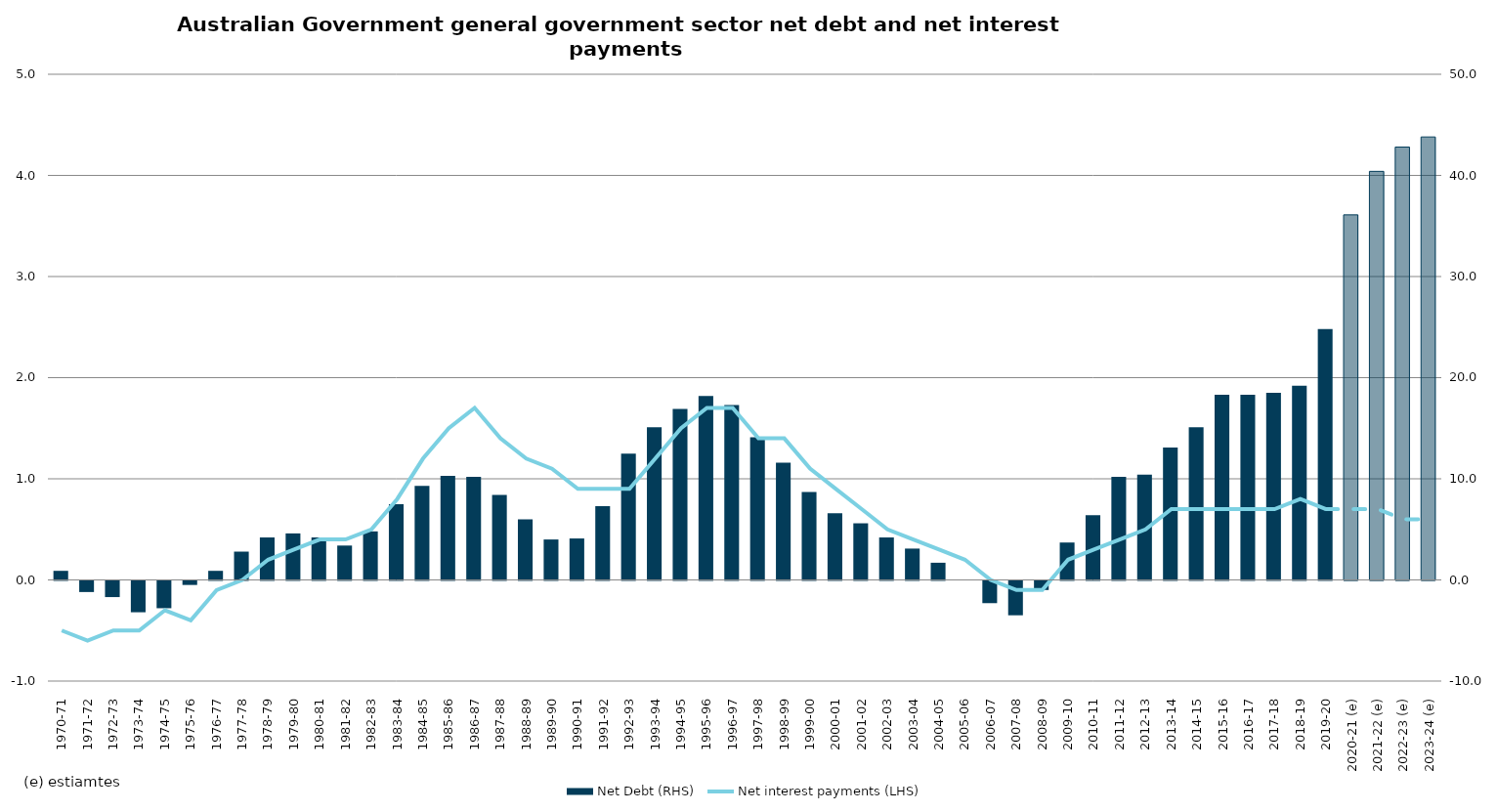
| Category | Net Debt (RHS) |
|---|---|
| 1970-71 | 0.9 |
| 1971-72 | -1.1 |
| 1972-73 | -1.6 |
| 1973-74 | -3.1 |
| 1974-75 | -2.7 |
| 1975-76 | -0.4 |
| 1976-77 | 0.9 |
| 1977-78 | 2.8 |
| 1978-79 | 4.2 |
| 1979-80 | 4.6 |
| 1980-81 | 4.2 |
| 1981-82 | 3.4 |
| 1982-83 | 4.8 |
| 1983-84 | 7.5 |
| 1984-85 | 9.3 |
| 1985-86 | 10.3 |
| 1986-87 | 10.2 |
| 1987-88 | 8.4 |
| 1988-89 | 6 |
| 1989-90 | 4 |
| 1990-91 | 4.1 |
| 1991-92 | 7.3 |
| 1992-93 | 12.5 |
| 1993-94 | 15.1 |
| 1994-95 | 16.9 |
| 1995-96 | 18.2 |
| 1996-97 | 17.3 |
| 1997-98 | 14.1 |
| 1998-99 | 11.6 |
| 1999-00 | 8.7 |
| 2000-01 | 6.6 |
| 2001-02 | 5.6 |
| 2002-03 | 4.2 |
| 2003-04 | 3.1 |
| 2004-05 | 1.7 |
| 2005-06 | 0 |
| 2006-07 | -2.2 |
| 2007-08 | -3.4 |
| 2008-09 | -0.9 |
| 2009-10 | 3.7 |
| 2010-11 | 6.4 |
| 2011-12 | 10.2 |
| 2012-13 | 10.4 |
| 2013-14 | 13.1 |
| 2014-15 | 15.1 |
| 2015-16 | 18.3 |
| 2016-17 | 18.3 |
| 2017-18 | 18.5 |
| 2018-19 | 19.2 |
| 2019-20 | 24.8 |
| 2020-21 (e) | 36.1 |
| 2021-22 (e) | 40.4 |
| 2022-23 (e) | 42.8 |
| 2023-24 (e) | 43.8 |